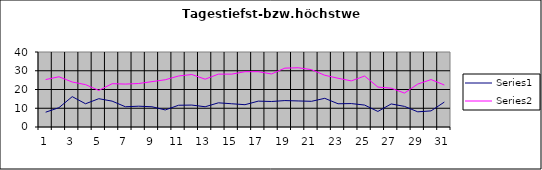
| Category | Series 0 | Series 1 |
|---|---|---|
| 0 | 7.9 | 25.3 |
| 1 | 10.3 | 26.8 |
| 2 | 16.2 | 24 |
| 3 | 12.4 | 22.6 |
| 4 | 15.1 | 19.5 |
| 5 | 13.8 | 23.1 |
| 6 | 10.8 | 22.9 |
| 7 | 11.1 | 23.2 |
| 8 | 10.8 | 24.2 |
| 9 | 9.1 | 25.2 |
| 10 | 11.6 | 27.2 |
| 11 | 11.7 | 28 |
| 12 | 10.8 | 25.5 |
| 13 | 12.9 | 28.2 |
| 14 | 12.4 | 28.2 |
| 15 | 11.9 | 29.5 |
| 16 | 13.8 | 29.5 |
| 17 | 13.6 | 28.3 |
| 18 | 14.1 | 31.4 |
| 19 | 13.9 | 31.6 |
| 20 | 13.7 | 30.6 |
| 21 | 15.3 | 27.6 |
| 22 | 12.4 | 26 |
| 23 | 12.5 | 24.6 |
| 24 | 11.7 | 27.2 |
| 25 | 8.3 | 21.3 |
| 26 | 12.3 | 20.7 |
| 27 | 11 | 18.1 |
| 28 | 8.1 | 22.9 |
| 29 | 8.6 | 25.3 |
| 30 | 13.3 | 22.4 |